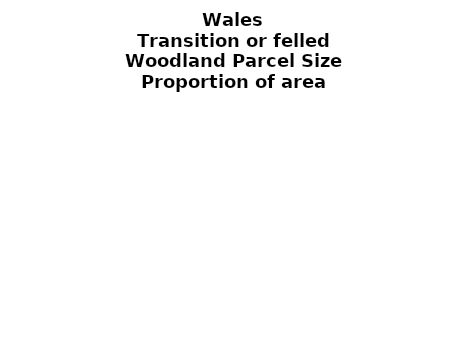
| Category | Transition or felled |
|---|---|
| <5 ha | 0.04 |
| ≥5 and <10 ha | 0.053 |
| ≥10 and <15 ha | 0.008 |
| ≥15 and <20 ha | 0 |
| ≥20 and <25 ha | 0.001 |
| ≥25 and <30 ha | 0.044 |
| ≥30 and <35 ha | 0 |
| ≥35 and <40 ha | 0 |
| ≥40 and <45 ha | 0.001 |
| ≥45 and <50 ha | 0 |
| ≥50 and <60 ha | 0 |
| ≥60 and <70 ha | 0.009 |
| ≥70 and <80 ha | 0 |
| ≥80 and <90 ha | 0.026 |
| ≥90 and <100 ha | 0.003 |
| ≥100 and <150 ha | 0.038 |
| ≥150 and <200 ha | 0.051 |
| ≥200 ha | 0.725 |